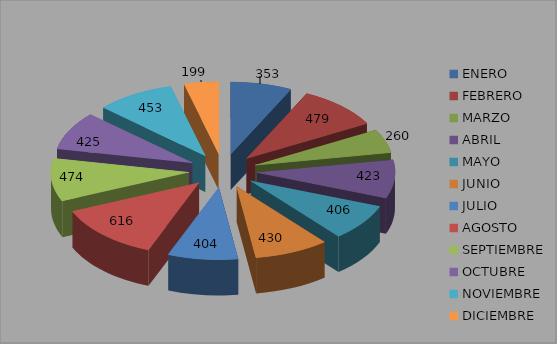
| Category | SOLICITUDES RECIBIDAS  ANUAL 2016 |
|---|---|
| ENERO | 353 |
| FEBRERO | 479 |
| MARZO | 260 |
| ABRIL | 423 |
| MAYO | 406 |
| JUNIO | 430 |
| JULIO | 404 |
| AGOSTO | 616 |
| SEPTIEMBRE | 474 |
| OCTUBRE | 425 |
| NOVIEMBRE | 453 |
| DICIEMBRE | 199 |